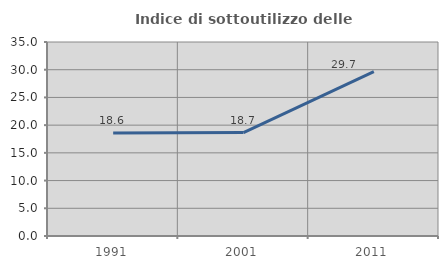
| Category | Indice di sottoutilizzo delle abitazioni  |
|---|---|
| 1991.0 | 18.598 |
| 2001.0 | 18.663 |
| 2011.0 | 29.66 |